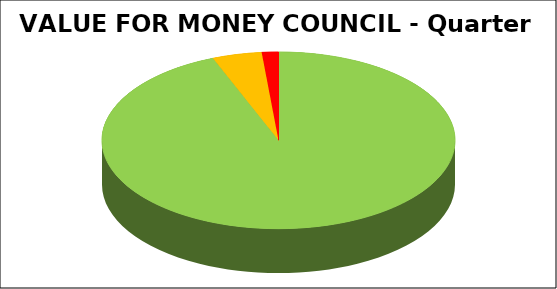
| Category | Series 0 |
|---|---|
| Green | 0.939 |
| Amber | 0.045 |
| Red | 0.015 |